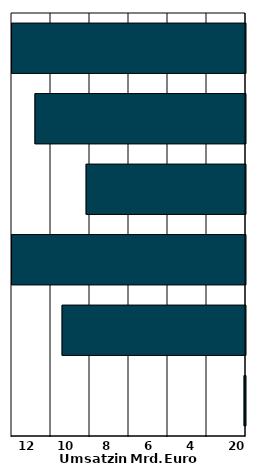
| Category | Series 0 |
|---|---|
| 0 | -0.073 |
| 1 | -9.406 |
| 2 | -14.225 |
| 3 | -8.174 |
| 4 | -10.798 |
| 5 | -33.82 |